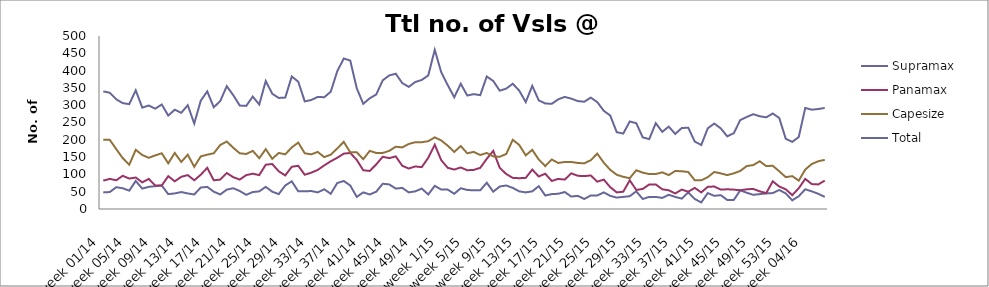
| Category | Supramax | Panamax | Capesize | Total |
|---|---|---|---|---|
| week 01/14 | 48 | 82 | 200 | 340 |
| week 02/14 | 49 | 87 | 200 | 336 |
| week 03/14 | 63 | 83 | 173 | 317 |
| week 04/14 | 60 | 96 | 147 | 306 |
| week 05/14 | 53 | 88 | 128 | 303 |
| week 06/14 | 81 | 91 | 171 | 343 |
| week 07/14 | 59 | 77 | 156 | 293 |
| week 08/14 | 64 | 87 | 148 | 299 |
| week 09/14 | 66 | 68 | 155 | 290 |
| week 10/14 | 68 | 68 | 161 | 302 |
| week 11/14 | 43 | 95 | 132 | 270 |
| week 12/14 | 45 | 80 | 162 | 287 |
| week 13/14 | 49 | 93 | 136 | 278 |
| week 14/14 | 45 | 98 | 157 | 300 |
| week 15/14 | 42 | 83 | 122 | 247 |
| week 16/14 | 62 | 99 | 152 | 313 |
| week 17/14 | 64 | 119 | 157 | 340 |
| week 18/14 | 50 | 83 | 161 | 294 |
| week 19/14 | 42 | 85 | 185 | 312 |
| week 20/14 | 56 | 104 | 195 | 355 |
| week 21/14 | 60 | 92 | 177 | 329 |
| week 22/14 | 52 | 85 | 161 | 299 |
| week 23/14 | 41 | 98 | 159 | 298 |
| week 24/14 | 49 | 102 | 168 | 325 |
| week 25/14 | 51 | 98 | 147 | 302 |
| week 26/14 | 64 | 128 | 173 | 370 |
| week 27/14 | 50 | 130 | 145 | 333 |
| week 28/14 | 43 | 109 | 162 | 321 |
| week 29/14 | 68 | 97 | 158 | 322 |
| week 30/14 | 80 | 122 | 178 | 383 |
| week 31/14 | 51 | 125 | 192 | 368 |
| week 32/14 | 51 | 99 | 161 | 311 |
| week 33/14 | 52 | 105 | 158 | 315 |
| week 34/14 | 48 | 113 | 165 | 324 |
| week 35/14 | 57 | 126 | 150 | 323 |
| week 36/14 | 44 | 138 | 157 | 339 |
| week 37/14 | 75 | 148 | 175 | 398 |
| week 38/14 | 81 | 160 | 194 | 435 |
| week 39/14 | 68 | 162 | 164 | 429 |
| week 40/14 | 35 | 142 | 164 | 349 |
| week 41/14 | 48 | 112 | 144 | 304 |
| week 42/14 | 42 | 110 | 168 | 320 |
| week 43/14 | 50 | 129 | 162 | 331 |
| week 44/14 | 73 | 151 | 162 | 372 |
| week 45/14 | 71 | 147 | 168 | 386 |
| week 46/14 | 59 | 152 | 180 | 391 |
| week 47/14 | 61 | 125 | 178 | 364 |
| week 48/14 | 48 | 117 | 188 | 353 |
| week 49/14 | 51 | 123 | 193 | 367 |
| week 50/14 | 59 | 121 | 193 | 373 |
| week 51/14 | 42 | 148 | 196 | 386 |
| week 52/14 | 67 | 186 | 207 | 460 |
| week 1/15 | 56 | 141 | 198 | 395 |
| week 2/15 | 56 | 119 | 183 | 358 |
| week 3/15 | 44 | 114 | 165 | 323 |
| week 4/15 | 60 | 120 | 182 | 362 |
| week 5/15 | 55 | 112 | 161 | 328 |
| week 6/15 | 54 | 113 | 165 | 332 |
| week 7/15 | 54 | 119 | 156 | 329 |
| week 8/15 | 76 | 145 | 162 | 383 |
| week 9/15 | 50 | 168 | 152 | 370 |
| week 10/15 | 65 | 119 | 151 | 342 |
| week 11/15 | 68 | 101 | 159 | 348 |
| week 12/15 | 61 | 90 | 200 | 362 |
| week 13/15 | 51 | 89 | 185 | 342 |
| week 14/15 | 48 | 90 | 155 | 309 |
| week 15/15 | 51 | 114 | 171 | 356 |
| week 16/15 | 66 | 94 | 143 | 314 |
| week 17/15 | 39 | 102 | 124 | 305 |
| week 18/15 | 43 | 81 | 143 | 304 |
| week 19/15 | 44 | 87 | 133 | 317 |
| week 20/15 | 49 | 85 | 136 | 324 |
| week 21/15 | 36 | 103 | 136 | 319 |
| week 22/15 | 38 | 96 | 133 | 312 |
| week 23/15 | 29 | 95 | 132 | 310 |
| week 24/15 | 39 | 97 | 141 | 322 |
| week 25/15 | 39 | 79 | 160 | 309 |
| week 26/15 | 48 | 85 | 134 | 284 |
| week 27/15 | 38 | 63 | 113 | 270 |
| week 28/15 | 33 | 48 | 99 | 222 |
| week 29/15 | 35 | 50 | 93 | 218 |
| week 30/15 | 37 | 83 | 89 | 253 |
| week 31/15 | 51 | 55 | 112 | 248 |
| week 32/15 | 29 | 58 | 105 | 207 |
| week 33/15 | 35 | 71 | 101 | 202 |
| week 34/15 | 35 | 71 | 101 | 248 |
| week 35/15 | 32 | 57 | 106 | 223 |
| week 36/15 | 41 | 54 | 98 | 238 |
| week 37/15 | 35 | 45 | 110 | 217 |
| week 38/15 | 30 | 56 | 109 | 234 |
| week 39/15 | 48 | 50 | 107 | 235 |
| week 40/15 | 29 | 61 | 83 | 195 |
| week 41/15 | 19 | 48 | 83 | 185 |
| week 42/15 | 46 | 64 | 92 | 233 |
| week 43/15 | 38 | 65 | 107 | 247 |
| week 44/15 | 40 | 56 | 103 | 233 |
| week 45/15 | 26 | 57 | 98 | 210 |
| week 46/15 | 26 | 56 | 103 | 219 |
| week 47/15 | 54 | 54 | 110 | 257 |
| week 48/15 | 47 | 57 | 124 | 266 |
| week 49/15 | 41 | 58 | 127 | 274 |
| week 50/15 | 43 | 51 | 138 | 268 |
| week 51/15 | 45 | 46 | 124 | 265 |
| week 52/15 | 46 | 80 | 125 | 276 |
| week 53/15 | 55 | 65 | 109 | 263 |
| week 01/16 | 45 | 57 | 92 | 203 |
| week 02/16 | 25 | 40 | 95 | 194 |
| week 03/16 | 37 | 60 | 82 | 208 |
| week 04/16 | 57 | 87 | 114 | 292 |
| week 05/16 | 51 | 72 | 130 | 287 |
| week 06/16 | 44 | 71 | 138 | 289 |